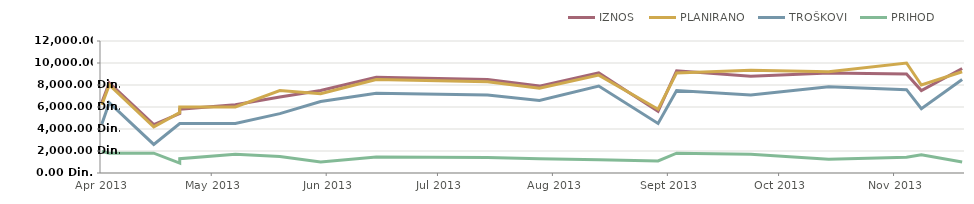
| Category | IZNOS | PLANIRANO | TROŠKOVI | PRIHOD |
|---|---|---|---|---|
| 2013-04-23 | 6400 | 6200 | 4450 | 1950 |
| 2013-04-25 | 8200 | 8000 | 6400 | 1800 |
| 2013-05-07 | 4400 | 4200 | 2600 | 1800 |
| 2013-05-14 | 5400 | 5500 | 4500 | 900 |
| 2013-05-14 | 5800 | 6000 | 4500 | 1300 |
| 2013-05-29 | 6200 | 6000 | 4500 | 1700 |
| 2013-06-10 | 6900 | 7500 | 5400 | 1500 |
| 2013-06-21 | 7500 | 7200 | 6500 | 1000 |
| 2013-07-06 | 8700 | 8500 | 7250 | 1450 |
| 2013-08-05 | 8500 | 8300 | 7100 | 1400 |
| 2013-08-19 | 7900 | 7700 | 6600 | 1300 |
| 2013-09-04 | 9100 | 8900 | 7900 | 1200 |
| 2013-09-20 | 5600 | 5800 | 4500 | 1100 |
| 2013-09-25 | 9300 | 9100 | 7500 | 1800 |
| 2013-10-15 | 8800 | 9350 | 7100 | 1700 |
| 2013-11-05 | 9100 | 9200 | 7850 | 1250 |
| 2013-11-26 | 9000 | 10000 | 7575 | 1425 |
| 2013-11-30 | 7500 | 8000 | 5850 | 1650 |
| 2013-12-11 | 9500 | 9200 | 8500 | 1000 |